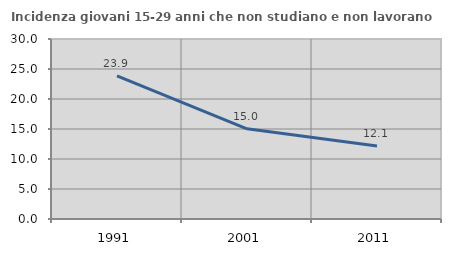
| Category | Incidenza giovani 15-29 anni che non studiano e non lavorano  |
|---|---|
| 1991.0 | 23.862 |
| 2001.0 | 15.038 |
| 2011.0 | 12.15 |